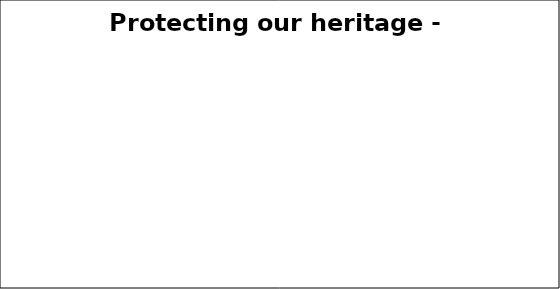
| Category | Q3 |
|---|---|
| Green | 0 |
| Amber | 0 |
| Red | 0 |